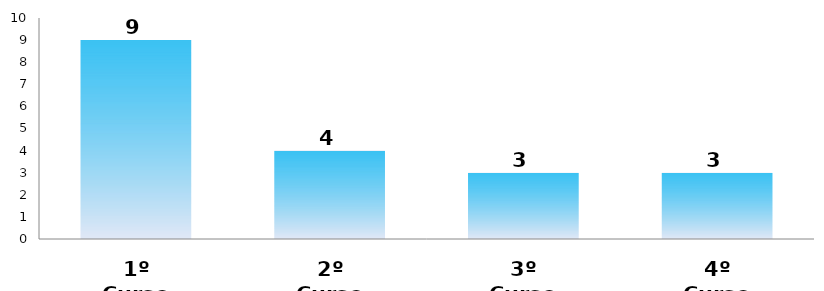
| Category | Series 0 |
|---|---|
| 1º Curso | 9 |
| 2º Curso | 4 |
| 3º Curso | 3 |
| 4º Curso | 3 |